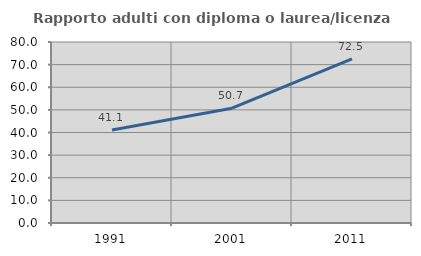
| Category | Rapporto adulti con diploma o laurea/licenza media  |
|---|---|
| 1991.0 | 41.121 |
| 2001.0 | 50.739 |
| 2011.0 | 72.512 |